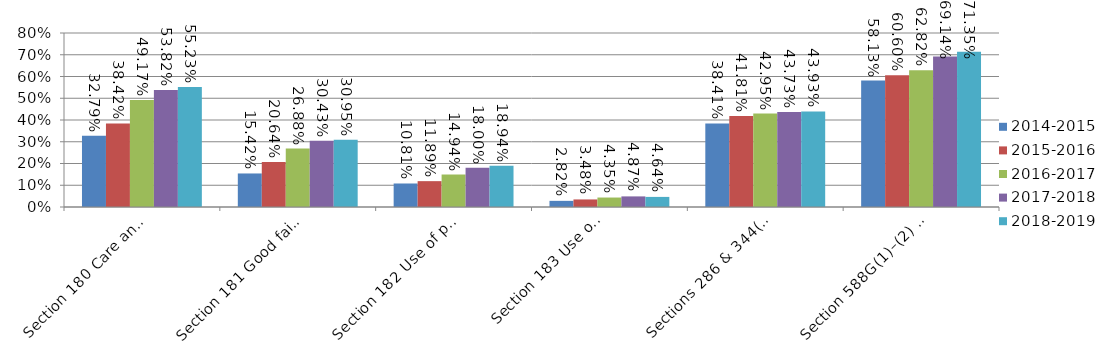
| Category | 2014-2015 | 2015-2016 | 2016-2017 | 2017-2018 | 2018-2019 |
|---|---|---|---|---|---|
| Section 180 Care and diligence—Directors’ and officers’ duties | 0.328 | 0.384 | 0.492 | 0.538 | 0.552 |
| Section 181 Good faith—Directors’ and officers’ duties | 0.154 | 0.206 | 0.269 | 0.304 | 0.31 |
| Section 182 Use of position—Directors’, officers’ and employees’ duties | 0.108 | 0.119 | 0.149 | 0.18 | 0.189 |
| Section 183 Use of information—
Directors’, officers’ and employees’ duties | 0.028 | 0.035 | 0.044 | 0.049 | 0.046 |
| Sections 286 & 344(1) Obligation to keep financial records | 0.384 | 0.418 | 0.429 | 0.437 | 0.439 |
| Section 588G(1)–(2) Insolvent trading | 0.581 | 0.606 | 0.628 | 0.691 | 0.714 |